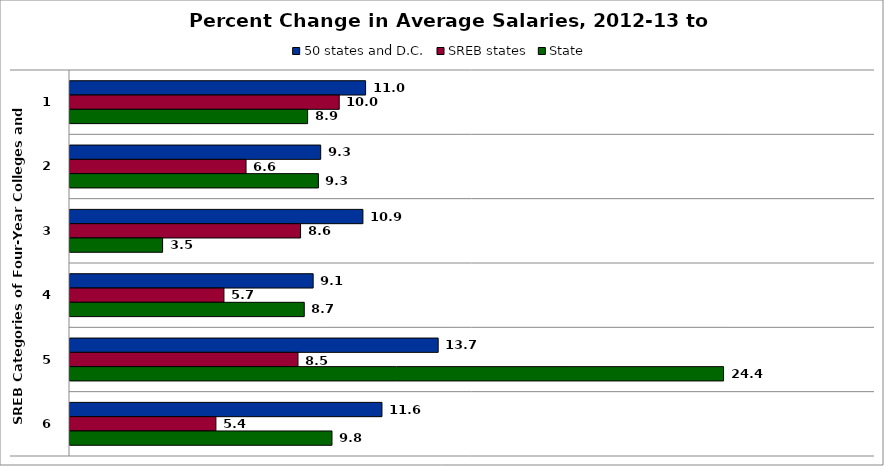
| Category | 50 states and D.C. | SREB states | State |
|---|---|---|---|
| 0 | 11.016 | 10.033 | 8.855 |
| 1 | 9.343 | 6.561 | 9.257 |
| 2 | 10.916 | 8.593 | 3.451 |
| 3 | 9.062 | 5.737 | 8.73 |
| 4 | 13.721 | 8.497 | 24.356 |
| 5 | 11.626 | 5.438 | 9.763 |